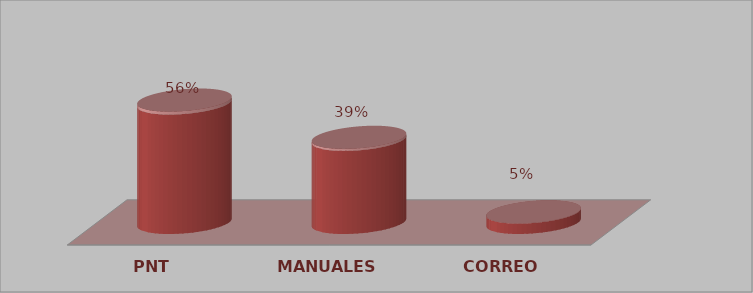
| Category | Series 0 | Series 1 |
|---|---|---|
| PNT | 23 | 0.561 |
| MANUALES | 16 | 0.39 |
| CORREO | 2 | 0.049 |